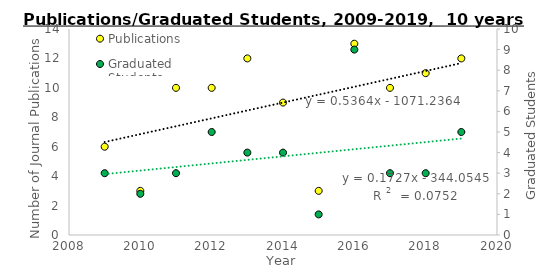
| Category | Publications |
|---|---|
| 2009.0 | 6 |
| 2010.0 | 3 |
| 2011.0 | 10 |
| 2012.0 | 10 |
| 2013.0 | 12 |
| 2014.0 | 9 |
| 2015.0 | 3 |
| 2016.0 | 13 |
| 2017.0 | 10 |
| 2018.0 | 11 |
| 2019.0 | 12 |